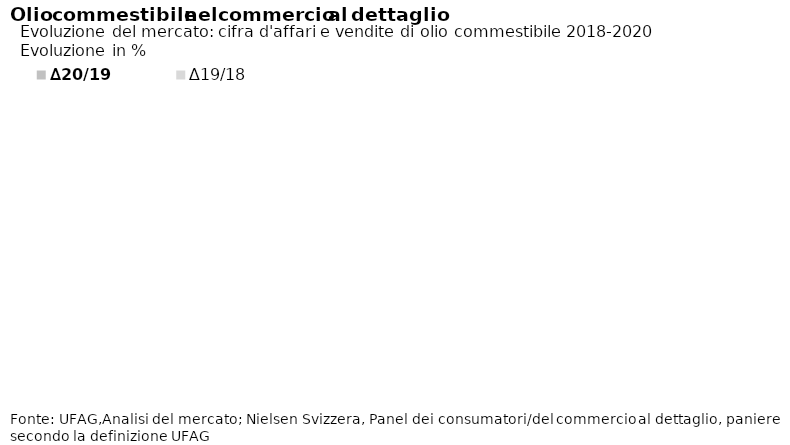
| Category | ∆20/19 | ∆19/18 |
|---|---|---|
| Olio di colza | 8.265 | 1.97 |
| Olio di girasole | 12.71 | 1.311 |
| Olio d'oliva | 11.154 | 5.177 |
| Altri | 8.07 | 0.929 |